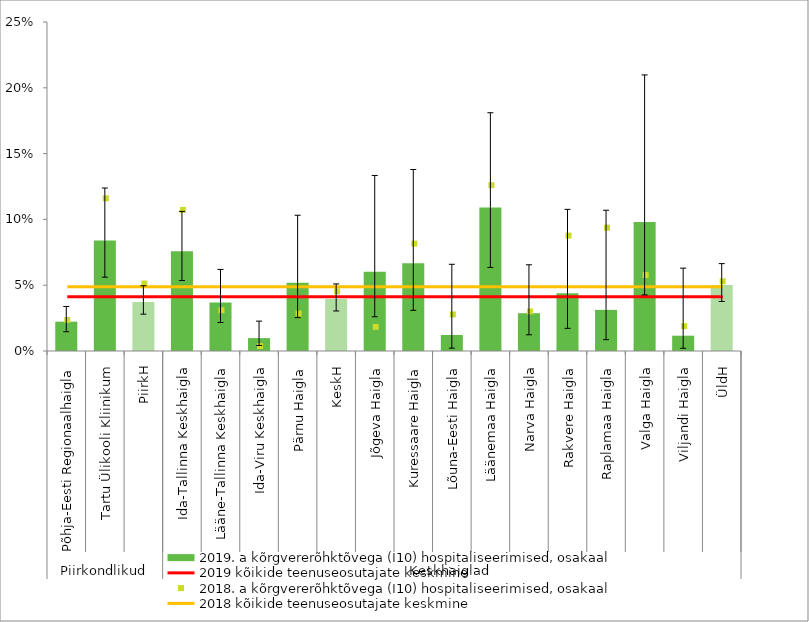
| Category | 2019. a kõrgvererõhktõvega (I10) hospitaliseerimised, osakaal |
|---|---|
| 0 | 0.022 |
| 1 | 0.084 |
| 2 | 0.037 |
| 3 | 0.076 |
| 4 | 0.037 |
| 5 | 0.01 |
| 6 | 0.052 |
| 7 | 0.039 |
| 8 | 0.06 |
| 9 | 0.067 |
| 10 | 0.012 |
| 11 | 0.109 |
| 12 | 0.029 |
| 13 | 0.044 |
| 14 | 0.031 |
| 15 | 0.098 |
| 16 | 0.012 |
| 17 | 0.05 |